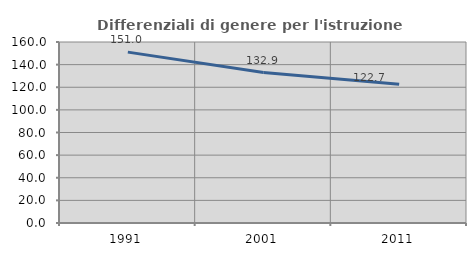
| Category | Differenziali di genere per l'istruzione superiore |
|---|---|
| 1991.0 | 151.046 |
| 2001.0 | 132.948 |
| 2011.0 | 122.715 |